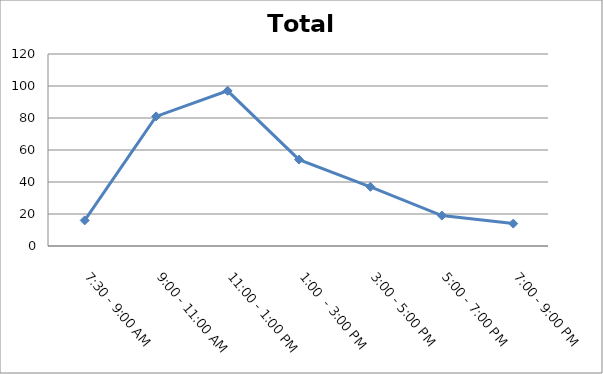
| Category | Total |
|---|---|
| 7:30 - 9:00 AM | 16 |
| 9:00 - 11:00 AM | 81 |
| 11:00 - 1:00 PM | 97 |
| 1:00  - 3:00 PM | 54 |
| 3:00 - 5:00 PM | 37 |
| 5:00 - 7:00 PM | 19 |
| 7:00 - 9:00 PM | 14 |